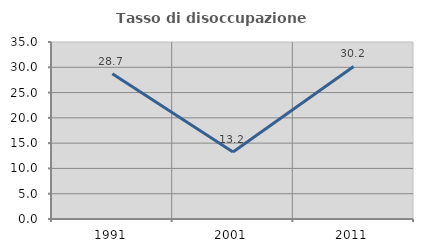
| Category | Tasso di disoccupazione giovanile  |
|---|---|
| 1991.0 | 28.704 |
| 2001.0 | 13.235 |
| 2011.0 | 30.159 |